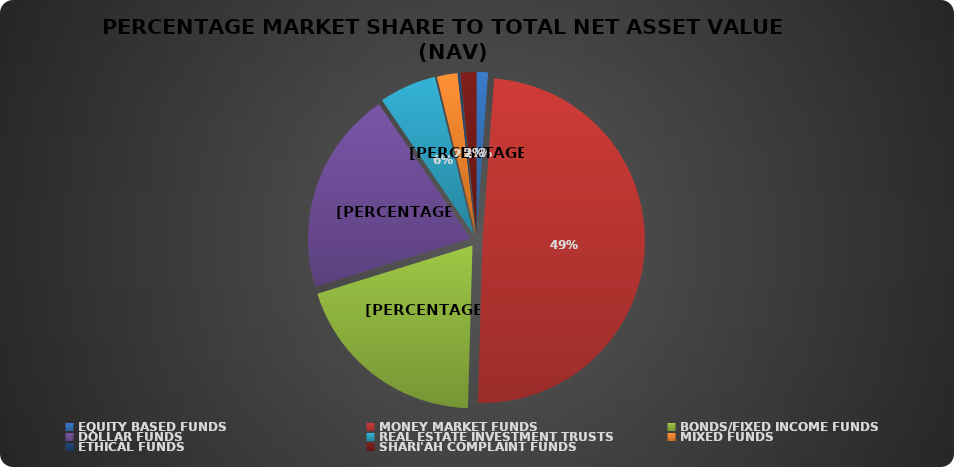
| Category | NET ASSET VALUE |
|---|---|
| EQUITY BASED FUNDS | 18617819180.26 |
| MONEY MARKET FUNDS | 807261945859.454 |
| BONDS/FIXED INCOME FUNDS | 323395950269.539 |
| DOLLAR FUNDS | 331906740337.944 |
| REAL ESTATE INVESTMENT TRUSTS | 93351135037.83 |
| MIXED FUNDS | 33634490477.322 |
| ETHICAL FUNDS | 3224901792.58 |
| SHARI'AH COMPLAINT FUNDS | 25701609592.03 |